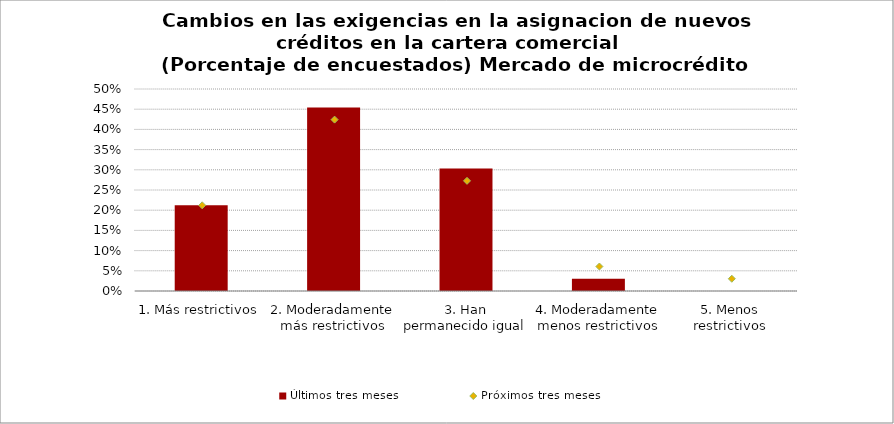
| Category | Últimos tres meses |
|---|---|
| 1. Más restrictivos | 0.212 |
| 2. Moderadamente más restrictivos | 0.454 |
| 3. Han permanecido igual | 0.303 |
| 4. Moderadamente menos restrictivos | 0.03 |
| 5. Menos restrictivos | 0 |